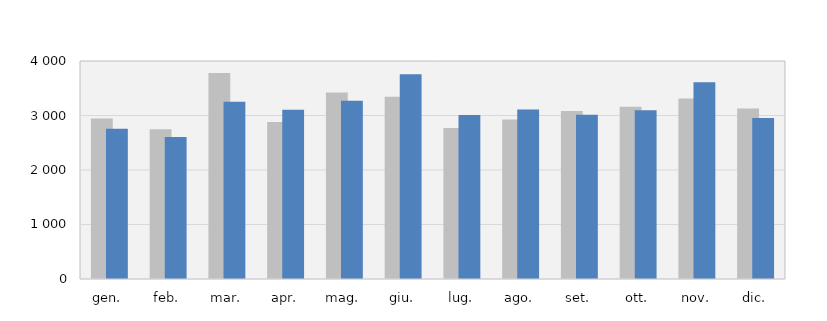
| Category | 2017 | 2018 |
|---|---|---|
| gen. | 2947 | 2759 |
| feb. | 2747 | 2604 |
| mar. | 3780 | 3253 |
| apr. | 2879 | 3106 |
| mag. | 3421 | 3269 |
| giu. | 3346 | 3756 |
| lug. | 2772 | 3007 |
| ago. | 2925 | 3108 |
| set. | 3082 | 3013 |
| ott. | 3159 | 3098 |
| nov. | 3313 | 3609 |
| dic. | 3128 | 2956 |